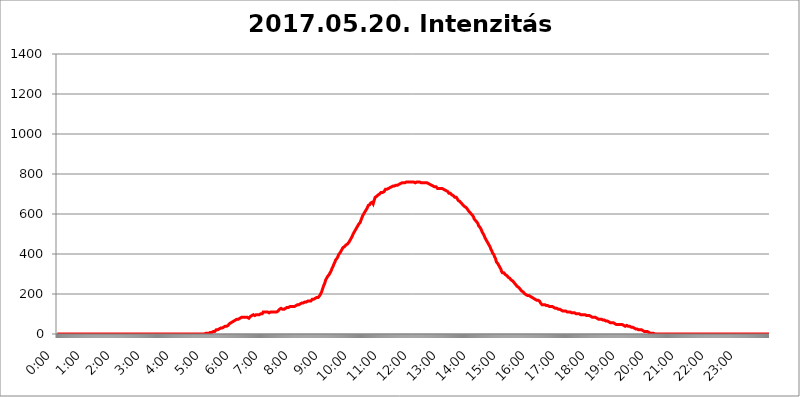
| Category | 2017.05.20. Intenzitás [W/m^2] |
|---|---|
| 0.0 | 0 |
| 0.0006944444444444445 | 0 |
| 0.001388888888888889 | 0 |
| 0.0020833333333333333 | 0 |
| 0.002777777777777778 | 0 |
| 0.003472222222222222 | 0 |
| 0.004166666666666667 | 0 |
| 0.004861111111111111 | 0 |
| 0.005555555555555556 | 0 |
| 0.0062499999999999995 | 0 |
| 0.006944444444444444 | 0 |
| 0.007638888888888889 | 0 |
| 0.008333333333333333 | 0 |
| 0.009027777777777779 | 0 |
| 0.009722222222222222 | 0 |
| 0.010416666666666666 | 0 |
| 0.011111111111111112 | 0 |
| 0.011805555555555555 | 0 |
| 0.012499999999999999 | 0 |
| 0.013194444444444444 | 0 |
| 0.013888888888888888 | 0 |
| 0.014583333333333332 | 0 |
| 0.015277777777777777 | 0 |
| 0.015972222222222224 | 0 |
| 0.016666666666666666 | 0 |
| 0.017361111111111112 | 0 |
| 0.018055555555555557 | 0 |
| 0.01875 | 0 |
| 0.019444444444444445 | 0 |
| 0.02013888888888889 | 0 |
| 0.020833333333333332 | 0 |
| 0.02152777777777778 | 0 |
| 0.022222222222222223 | 0 |
| 0.02291666666666667 | 0 |
| 0.02361111111111111 | 0 |
| 0.024305555555555556 | 0 |
| 0.024999999999999998 | 0 |
| 0.025694444444444447 | 0 |
| 0.02638888888888889 | 0 |
| 0.027083333333333334 | 0 |
| 0.027777777777777776 | 0 |
| 0.02847222222222222 | 0 |
| 0.029166666666666664 | 0 |
| 0.029861111111111113 | 0 |
| 0.030555555555555555 | 0 |
| 0.03125 | 0 |
| 0.03194444444444445 | 0 |
| 0.03263888888888889 | 0 |
| 0.03333333333333333 | 0 |
| 0.034027777777777775 | 0 |
| 0.034722222222222224 | 0 |
| 0.035416666666666666 | 0 |
| 0.036111111111111115 | 0 |
| 0.03680555555555556 | 0 |
| 0.0375 | 0 |
| 0.03819444444444444 | 0 |
| 0.03888888888888889 | 0 |
| 0.03958333333333333 | 0 |
| 0.04027777777777778 | 0 |
| 0.04097222222222222 | 0 |
| 0.041666666666666664 | 0 |
| 0.042361111111111106 | 0 |
| 0.04305555555555556 | 0 |
| 0.043750000000000004 | 0 |
| 0.044444444444444446 | 0 |
| 0.04513888888888889 | 0 |
| 0.04583333333333334 | 0 |
| 0.04652777777777778 | 0 |
| 0.04722222222222222 | 0 |
| 0.04791666666666666 | 0 |
| 0.04861111111111111 | 0 |
| 0.049305555555555554 | 0 |
| 0.049999999999999996 | 0 |
| 0.05069444444444445 | 0 |
| 0.051388888888888894 | 0 |
| 0.052083333333333336 | 0 |
| 0.05277777777777778 | 0 |
| 0.05347222222222222 | 0 |
| 0.05416666666666667 | 0 |
| 0.05486111111111111 | 0 |
| 0.05555555555555555 | 0 |
| 0.05625 | 0 |
| 0.05694444444444444 | 0 |
| 0.057638888888888885 | 0 |
| 0.05833333333333333 | 0 |
| 0.05902777777777778 | 0 |
| 0.059722222222222225 | 0 |
| 0.06041666666666667 | 0 |
| 0.061111111111111116 | 0 |
| 0.06180555555555556 | 0 |
| 0.0625 | 0 |
| 0.06319444444444444 | 0 |
| 0.06388888888888888 | 0 |
| 0.06458333333333334 | 0 |
| 0.06527777777777778 | 0 |
| 0.06597222222222222 | 0 |
| 0.06666666666666667 | 0 |
| 0.06736111111111111 | 0 |
| 0.06805555555555555 | 0 |
| 0.06874999999999999 | 0 |
| 0.06944444444444443 | 0 |
| 0.07013888888888889 | 0 |
| 0.07083333333333333 | 0 |
| 0.07152777777777779 | 0 |
| 0.07222222222222223 | 0 |
| 0.07291666666666667 | 0 |
| 0.07361111111111111 | 0 |
| 0.07430555555555556 | 0 |
| 0.075 | 0 |
| 0.07569444444444444 | 0 |
| 0.0763888888888889 | 0 |
| 0.07708333333333334 | 0 |
| 0.07777777777777778 | 0 |
| 0.07847222222222222 | 0 |
| 0.07916666666666666 | 0 |
| 0.0798611111111111 | 0 |
| 0.08055555555555556 | 0 |
| 0.08125 | 0 |
| 0.08194444444444444 | 0 |
| 0.08263888888888889 | 0 |
| 0.08333333333333333 | 0 |
| 0.08402777777777777 | 0 |
| 0.08472222222222221 | 0 |
| 0.08541666666666665 | 0 |
| 0.08611111111111112 | 0 |
| 0.08680555555555557 | 0 |
| 0.08750000000000001 | 0 |
| 0.08819444444444445 | 0 |
| 0.08888888888888889 | 0 |
| 0.08958333333333333 | 0 |
| 0.09027777777777778 | 0 |
| 0.09097222222222222 | 0 |
| 0.09166666666666667 | 0 |
| 0.09236111111111112 | 0 |
| 0.09305555555555556 | 0 |
| 0.09375 | 0 |
| 0.09444444444444444 | 0 |
| 0.09513888888888888 | 0 |
| 0.09583333333333333 | 0 |
| 0.09652777777777777 | 0 |
| 0.09722222222222222 | 0 |
| 0.09791666666666667 | 0 |
| 0.09861111111111111 | 0 |
| 0.09930555555555555 | 0 |
| 0.09999999999999999 | 0 |
| 0.10069444444444443 | 0 |
| 0.1013888888888889 | 0 |
| 0.10208333333333335 | 0 |
| 0.10277777777777779 | 0 |
| 0.10347222222222223 | 0 |
| 0.10416666666666667 | 0 |
| 0.10486111111111111 | 0 |
| 0.10555555555555556 | 0 |
| 0.10625 | 0 |
| 0.10694444444444444 | 0 |
| 0.1076388888888889 | 0 |
| 0.10833333333333334 | 0 |
| 0.10902777777777778 | 0 |
| 0.10972222222222222 | 0 |
| 0.1111111111111111 | 0 |
| 0.11180555555555556 | 0 |
| 0.11180555555555556 | 0 |
| 0.1125 | 0 |
| 0.11319444444444444 | 0 |
| 0.11388888888888889 | 0 |
| 0.11458333333333333 | 0 |
| 0.11527777777777777 | 0 |
| 0.11597222222222221 | 0 |
| 0.11666666666666665 | 0 |
| 0.1173611111111111 | 0 |
| 0.11805555555555557 | 0 |
| 0.11944444444444445 | 0 |
| 0.12013888888888889 | 0 |
| 0.12083333333333333 | 0 |
| 0.12152777777777778 | 0 |
| 0.12222222222222223 | 0 |
| 0.12291666666666667 | 0 |
| 0.12291666666666667 | 0 |
| 0.12361111111111112 | 0 |
| 0.12430555555555556 | 0 |
| 0.125 | 0 |
| 0.12569444444444444 | 0 |
| 0.12638888888888888 | 0 |
| 0.12708333333333333 | 0 |
| 0.16875 | 0 |
| 0.12847222222222224 | 0 |
| 0.12916666666666668 | 0 |
| 0.12986111111111112 | 0 |
| 0.13055555555555556 | 0 |
| 0.13125 | 0 |
| 0.13194444444444445 | 0 |
| 0.1326388888888889 | 0 |
| 0.13333333333333333 | 0 |
| 0.13402777777777777 | 0 |
| 0.13402777777777777 | 0 |
| 0.13472222222222222 | 0 |
| 0.13541666666666666 | 0 |
| 0.1361111111111111 | 0 |
| 0.13749999999999998 | 0 |
| 0.13819444444444443 | 0 |
| 0.1388888888888889 | 0 |
| 0.13958333333333334 | 0 |
| 0.14027777777777778 | 0 |
| 0.14097222222222222 | 0 |
| 0.14166666666666666 | 0 |
| 0.1423611111111111 | 0 |
| 0.14305555555555557 | 0 |
| 0.14375000000000002 | 0 |
| 0.14444444444444446 | 0 |
| 0.1451388888888889 | 0 |
| 0.1451388888888889 | 0 |
| 0.14652777777777778 | 0 |
| 0.14722222222222223 | 0 |
| 0.14791666666666667 | 0 |
| 0.1486111111111111 | 0 |
| 0.14930555555555555 | 0 |
| 0.15 | 0 |
| 0.15069444444444444 | 0 |
| 0.15138888888888888 | 0 |
| 0.15208333333333332 | 0 |
| 0.15277777777777776 | 0 |
| 0.15347222222222223 | 0 |
| 0.15416666666666667 | 0 |
| 0.15486111111111112 | 0 |
| 0.15555555555555556 | 0 |
| 0.15625 | 0 |
| 0.15694444444444444 | 0 |
| 0.15763888888888888 | 0 |
| 0.15833333333333333 | 0 |
| 0.15902777777777777 | 0 |
| 0.15972222222222224 | 0 |
| 0.16041666666666668 | 0 |
| 0.16111111111111112 | 0 |
| 0.16180555555555556 | 0 |
| 0.1625 | 0 |
| 0.16319444444444445 | 0 |
| 0.1638888888888889 | 0 |
| 0.16458333333333333 | 0 |
| 0.16527777777777777 | 0 |
| 0.16597222222222222 | 0 |
| 0.16666666666666666 | 0 |
| 0.1673611111111111 | 0 |
| 0.16805555555555554 | 0 |
| 0.16874999999999998 | 0 |
| 0.16944444444444443 | 0 |
| 0.17013888888888887 | 0 |
| 0.1708333333333333 | 0 |
| 0.17152777777777775 | 0 |
| 0.17222222222222225 | 0 |
| 0.1729166666666667 | 0 |
| 0.17361111111111113 | 0 |
| 0.17430555555555557 | 0 |
| 0.17500000000000002 | 0 |
| 0.17569444444444446 | 0 |
| 0.1763888888888889 | 0 |
| 0.17708333333333334 | 0 |
| 0.17777777777777778 | 0 |
| 0.17847222222222223 | 0 |
| 0.17916666666666667 | 0 |
| 0.1798611111111111 | 0 |
| 0.18055555555555555 | 0 |
| 0.18125 | 0 |
| 0.18194444444444444 | 0 |
| 0.1826388888888889 | 0 |
| 0.18333333333333335 | 0 |
| 0.1840277777777778 | 0 |
| 0.18472222222222223 | 0 |
| 0.18541666666666667 | 0 |
| 0.18611111111111112 | 0 |
| 0.18680555555555556 | 0 |
| 0.1875 | 0 |
| 0.18819444444444444 | 0 |
| 0.18888888888888888 | 0 |
| 0.18958333333333333 | 0 |
| 0.19027777777777777 | 0 |
| 0.1909722222222222 | 0 |
| 0.19166666666666665 | 0 |
| 0.19236111111111112 | 0 |
| 0.19305555555555554 | 0 |
| 0.19375 | 0 |
| 0.19444444444444445 | 0 |
| 0.1951388888888889 | 0 |
| 0.19583333333333333 | 0 |
| 0.19652777777777777 | 0 |
| 0.19722222222222222 | 0 |
| 0.19791666666666666 | 0 |
| 0.1986111111111111 | 0 |
| 0.19930555555555554 | 0 |
| 0.19999999999999998 | 0 |
| 0.20069444444444443 | 0 |
| 0.20138888888888887 | 0 |
| 0.2020833333333333 | 0 |
| 0.2027777777777778 | 0 |
| 0.2034722222222222 | 0 |
| 0.2041666666666667 | 0 |
| 0.20486111111111113 | 0 |
| 0.20555555555555557 | 0 |
| 0.20625000000000002 | 0 |
| 0.20694444444444446 | 3.525 |
| 0.2076388888888889 | 0 |
| 0.20833333333333334 | 3.525 |
| 0.20902777777777778 | 3.525 |
| 0.20972222222222223 | 3.525 |
| 0.21041666666666667 | 3.525 |
| 0.2111111111111111 | 3.525 |
| 0.21180555555555555 | 3.525 |
| 0.2125 | 3.525 |
| 0.21319444444444444 | 3.525 |
| 0.2138888888888889 | 7.887 |
| 0.21458333333333335 | 7.887 |
| 0.2152777777777778 | 7.887 |
| 0.21597222222222223 | 7.887 |
| 0.21666666666666667 | 7.887 |
| 0.21736111111111112 | 12.257 |
| 0.21805555555555556 | 12.257 |
| 0.21875 | 12.257 |
| 0.21944444444444444 | 12.257 |
| 0.22013888888888888 | 12.257 |
| 0.22083333333333333 | 12.257 |
| 0.22152777777777777 | 16.636 |
| 0.2222222222222222 | 16.636 |
| 0.22291666666666665 | 21.024 |
| 0.2236111111111111 | 21.024 |
| 0.22430555555555556 | 21.024 |
| 0.225 | 21.024 |
| 0.22569444444444445 | 21.024 |
| 0.2263888888888889 | 21.024 |
| 0.22708333333333333 | 25.419 |
| 0.22777777777777777 | 25.419 |
| 0.22847222222222222 | 25.419 |
| 0.22916666666666666 | 29.823 |
| 0.2298611111111111 | 29.823 |
| 0.23055555555555554 | 29.823 |
| 0.23124999999999998 | 29.823 |
| 0.23194444444444443 | 34.234 |
| 0.23263888888888887 | 34.234 |
| 0.2333333333333333 | 34.234 |
| 0.2340277777777778 | 34.234 |
| 0.2347222222222222 | 38.653 |
| 0.2354166666666667 | 38.653 |
| 0.23611111111111113 | 38.653 |
| 0.23680555555555557 | 38.653 |
| 0.23750000000000002 | 38.653 |
| 0.23819444444444446 | 38.653 |
| 0.2388888888888889 | 43.079 |
| 0.23958333333333334 | 43.079 |
| 0.24027777777777778 | 47.511 |
| 0.24097222222222223 | 47.511 |
| 0.24166666666666667 | 51.951 |
| 0.2423611111111111 | 56.398 |
| 0.24305555555555555 | 56.398 |
| 0.24375 | 56.398 |
| 0.24444444444444446 | 60.85 |
| 0.24513888888888888 | 60.85 |
| 0.24583333333333335 | 60.85 |
| 0.2465277777777778 | 65.31 |
| 0.24722222222222223 | 65.31 |
| 0.24791666666666667 | 65.31 |
| 0.24861111111111112 | 65.31 |
| 0.24930555555555556 | 69.775 |
| 0.25 | 69.775 |
| 0.25069444444444444 | 69.775 |
| 0.2513888888888889 | 69.775 |
| 0.2520833333333333 | 74.246 |
| 0.25277777777777777 | 74.246 |
| 0.2534722222222222 | 74.246 |
| 0.25416666666666665 | 74.246 |
| 0.2548611111111111 | 74.246 |
| 0.2555555555555556 | 78.722 |
| 0.25625000000000003 | 78.722 |
| 0.2569444444444445 | 78.722 |
| 0.2576388888888889 | 78.722 |
| 0.25833333333333336 | 83.205 |
| 0.2590277777777778 | 83.205 |
| 0.25972222222222224 | 83.205 |
| 0.2604166666666667 | 83.205 |
| 0.2611111111111111 | 83.205 |
| 0.26180555555555557 | 83.205 |
| 0.2625 | 83.205 |
| 0.26319444444444445 | 83.205 |
| 0.2638888888888889 | 83.205 |
| 0.26458333333333334 | 83.205 |
| 0.2652777777777778 | 83.205 |
| 0.2659722222222222 | 83.205 |
| 0.26666666666666666 | 83.205 |
| 0.2673611111111111 | 83.205 |
| 0.26805555555555555 | 83.205 |
| 0.26875 | 78.722 |
| 0.26944444444444443 | 78.722 |
| 0.2701388888888889 | 83.205 |
| 0.2708333333333333 | 87.692 |
| 0.27152777777777776 | 92.184 |
| 0.2722222222222222 | 92.184 |
| 0.27291666666666664 | 92.184 |
| 0.2736111111111111 | 92.184 |
| 0.2743055555555555 | 92.184 |
| 0.27499999999999997 | 96.682 |
| 0.27569444444444446 | 92.184 |
| 0.27638888888888885 | 92.184 |
| 0.27708333333333335 | 92.184 |
| 0.2777777777777778 | 96.682 |
| 0.27847222222222223 | 96.682 |
| 0.2791666666666667 | 96.682 |
| 0.2798611111111111 | 96.682 |
| 0.28055555555555556 | 96.682 |
| 0.28125 | 96.682 |
| 0.28194444444444444 | 96.682 |
| 0.2826388888888889 | 96.682 |
| 0.2833333333333333 | 96.682 |
| 0.28402777777777777 | 96.682 |
| 0.2847222222222222 | 96.682 |
| 0.28541666666666665 | 101.184 |
| 0.28611111111111115 | 101.184 |
| 0.28680555555555554 | 101.184 |
| 0.28750000000000003 | 101.184 |
| 0.2881944444444445 | 105.69 |
| 0.2888888888888889 | 110.201 |
| 0.28958333333333336 | 110.201 |
| 0.2902777777777778 | 110.201 |
| 0.29097222222222224 | 110.201 |
| 0.2916666666666667 | 110.201 |
| 0.2923611111111111 | 110.201 |
| 0.29305555555555557 | 110.201 |
| 0.29375 | 110.201 |
| 0.29444444444444445 | 105.69 |
| 0.2951388888888889 | 110.201 |
| 0.29583333333333334 | 105.69 |
| 0.2965277777777778 | 105.69 |
| 0.2972222222222222 | 105.69 |
| 0.29791666666666666 | 105.69 |
| 0.2986111111111111 | 110.201 |
| 0.29930555555555555 | 110.201 |
| 0.3 | 110.201 |
| 0.30069444444444443 | 110.201 |
| 0.3013888888888889 | 110.201 |
| 0.3020833333333333 | 110.201 |
| 0.30277777777777776 | 110.201 |
| 0.3034722222222222 | 110.201 |
| 0.30416666666666664 | 114.716 |
| 0.3048611111111111 | 110.201 |
| 0.3055555555555555 | 110.201 |
| 0.30624999999999997 | 110.201 |
| 0.3069444444444444 | 110.201 |
| 0.3076388888888889 | 110.201 |
| 0.30833333333333335 | 110.201 |
| 0.3090277777777778 | 110.201 |
| 0.30972222222222223 | 114.716 |
| 0.3104166666666667 | 114.716 |
| 0.3111111111111111 | 119.235 |
| 0.31180555555555556 | 123.758 |
| 0.3125 | 123.758 |
| 0.31319444444444444 | 128.284 |
| 0.3138888888888889 | 128.284 |
| 0.3145833333333333 | 128.284 |
| 0.31527777777777777 | 128.284 |
| 0.3159722222222222 | 123.758 |
| 0.31666666666666665 | 119.235 |
| 0.31736111111111115 | 123.758 |
| 0.31805555555555554 | 123.758 |
| 0.31875000000000003 | 123.758 |
| 0.3194444444444445 | 123.758 |
| 0.3201388888888889 | 128.284 |
| 0.32083333333333336 | 128.284 |
| 0.3215277777777778 | 132.814 |
| 0.32222222222222224 | 132.814 |
| 0.3229166666666667 | 132.814 |
| 0.3236111111111111 | 132.814 |
| 0.32430555555555557 | 132.814 |
| 0.325 | 132.814 |
| 0.32569444444444445 | 137.347 |
| 0.3263888888888889 | 137.347 |
| 0.32708333333333334 | 137.347 |
| 0.3277777777777778 | 137.347 |
| 0.3284722222222222 | 137.347 |
| 0.32916666666666666 | 137.347 |
| 0.3298611111111111 | 137.347 |
| 0.33055555555555555 | 137.347 |
| 0.33125 | 137.347 |
| 0.33194444444444443 | 137.347 |
| 0.3326388888888889 | 137.347 |
| 0.3333333333333333 | 137.347 |
| 0.3340277777777778 | 141.884 |
| 0.3347222222222222 | 141.884 |
| 0.3354166666666667 | 141.884 |
| 0.3361111111111111 | 146.423 |
| 0.3368055555555556 | 146.423 |
| 0.33749999999999997 | 146.423 |
| 0.33819444444444446 | 146.423 |
| 0.33888888888888885 | 146.423 |
| 0.33958333333333335 | 150.964 |
| 0.34027777777777773 | 150.964 |
| 0.34097222222222223 | 150.964 |
| 0.3416666666666666 | 150.964 |
| 0.3423611111111111 | 150.964 |
| 0.3430555555555555 | 155.509 |
| 0.34375 | 155.509 |
| 0.3444444444444445 | 155.509 |
| 0.3451388888888889 | 155.509 |
| 0.3458333333333334 | 155.509 |
| 0.34652777777777777 | 160.056 |
| 0.34722222222222227 | 160.056 |
| 0.34791666666666665 | 160.056 |
| 0.34861111111111115 | 160.056 |
| 0.34930555555555554 | 160.056 |
| 0.35000000000000003 | 160.056 |
| 0.3506944444444444 | 164.605 |
| 0.3513888888888889 | 164.605 |
| 0.3520833333333333 | 164.605 |
| 0.3527777777777778 | 164.605 |
| 0.3534722222222222 | 164.605 |
| 0.3541666666666667 | 164.605 |
| 0.3548611111111111 | 169.156 |
| 0.35555555555555557 | 164.605 |
| 0.35625 | 169.156 |
| 0.35694444444444445 | 169.156 |
| 0.3576388888888889 | 173.709 |
| 0.35833333333333334 | 173.709 |
| 0.3590277777777778 | 173.709 |
| 0.3597222222222222 | 173.709 |
| 0.36041666666666666 | 178.264 |
| 0.3611111111111111 | 178.264 |
| 0.36180555555555555 | 178.264 |
| 0.3625 | 178.264 |
| 0.36319444444444443 | 182.82 |
| 0.3638888888888889 | 182.82 |
| 0.3645833333333333 | 182.82 |
| 0.3652777777777778 | 182.82 |
| 0.3659722222222222 | 182.82 |
| 0.3666666666666667 | 187.378 |
| 0.3673611111111111 | 187.378 |
| 0.3680555555555556 | 191.937 |
| 0.36874999999999997 | 196.497 |
| 0.36944444444444446 | 201.058 |
| 0.37013888888888885 | 205.62 |
| 0.37083333333333335 | 210.182 |
| 0.37152777777777773 | 219.309 |
| 0.37222222222222223 | 223.873 |
| 0.3729166666666666 | 233 |
| 0.3736111111111111 | 242.127 |
| 0.3743055555555555 | 246.689 |
| 0.375 | 251.251 |
| 0.3756944444444445 | 260.373 |
| 0.3763888888888889 | 269.49 |
| 0.3770833333333334 | 274.047 |
| 0.37777777777777777 | 278.603 |
| 0.37847222222222227 | 283.156 |
| 0.37916666666666665 | 287.709 |
| 0.37986111111111115 | 287.709 |
| 0.38055555555555554 | 292.259 |
| 0.38125000000000003 | 296.808 |
| 0.3819444444444444 | 301.354 |
| 0.3826388888888889 | 305.898 |
| 0.3833333333333333 | 310.44 |
| 0.3840277777777778 | 314.98 |
| 0.3847222222222222 | 314.98 |
| 0.3854166666666667 | 328.584 |
| 0.3861111111111111 | 333.113 |
| 0.38680555555555557 | 337.639 |
| 0.3875 | 342.162 |
| 0.38819444444444445 | 351.198 |
| 0.3888888888888889 | 355.712 |
| 0.38958333333333334 | 360.221 |
| 0.3902777777777778 | 369.23 |
| 0.3909722222222222 | 369.23 |
| 0.39166666666666666 | 373.729 |
| 0.3923611111111111 | 378.224 |
| 0.39305555555555555 | 382.715 |
| 0.39375 | 387.202 |
| 0.39444444444444443 | 396.164 |
| 0.3951388888888889 | 396.164 |
| 0.3958333333333333 | 400.638 |
| 0.3965277777777778 | 405.108 |
| 0.3972222222222222 | 409.574 |
| 0.3979166666666667 | 414.035 |
| 0.3986111111111111 | 418.492 |
| 0.3993055555555556 | 422.943 |
| 0.39999999999999997 | 427.39 |
| 0.40069444444444446 | 431.833 |
| 0.40138888888888885 | 431.833 |
| 0.40208333333333335 | 436.27 |
| 0.40277777777777773 | 436.27 |
| 0.40347222222222223 | 440.702 |
| 0.4041666666666666 | 440.702 |
| 0.4048611111111111 | 445.129 |
| 0.4055555555555555 | 445.129 |
| 0.40625 | 449.551 |
| 0.4069444444444445 | 449.551 |
| 0.4076388888888889 | 453.968 |
| 0.4083333333333334 | 453.968 |
| 0.40902777777777777 | 458.38 |
| 0.40972222222222227 | 458.38 |
| 0.41041666666666665 | 467.187 |
| 0.41111111111111115 | 471.582 |
| 0.41180555555555554 | 475.972 |
| 0.41250000000000003 | 480.356 |
| 0.4131944444444444 | 484.735 |
| 0.4138888888888889 | 489.108 |
| 0.4145833333333333 | 489.108 |
| 0.4152777777777778 | 502.192 |
| 0.4159722222222222 | 502.192 |
| 0.4166666666666667 | 506.542 |
| 0.4173611111111111 | 515.223 |
| 0.41805555555555557 | 515.223 |
| 0.41875 | 523.88 |
| 0.41944444444444445 | 528.2 |
| 0.4201388888888889 | 532.513 |
| 0.42083333333333334 | 536.82 |
| 0.4215277777777778 | 541.121 |
| 0.4222222222222222 | 541.121 |
| 0.42291666666666666 | 549.704 |
| 0.4236111111111111 | 549.704 |
| 0.42430555555555555 | 553.986 |
| 0.425 | 558.261 |
| 0.42569444444444443 | 566.793 |
| 0.4263888888888889 | 571.049 |
| 0.4270833333333333 | 579.542 |
| 0.4277777777777778 | 583.779 |
| 0.4284722222222222 | 592.233 |
| 0.4291666666666667 | 592.233 |
| 0.4298611111111111 | 600.661 |
| 0.4305555555555556 | 604.864 |
| 0.43124999999999997 | 604.864 |
| 0.43194444444444446 | 613.252 |
| 0.43263888888888885 | 617.436 |
| 0.43333333333333335 | 621.613 |
| 0.43402777777777773 | 621.613 |
| 0.43472222222222223 | 629.948 |
| 0.4354166666666666 | 634.105 |
| 0.4361111111111111 | 642.4 |
| 0.4368055555555555 | 642.4 |
| 0.4375 | 646.537 |
| 0.4381944444444445 | 646.537 |
| 0.4388888888888889 | 650.667 |
| 0.4395833333333334 | 654.791 |
| 0.44027777777777777 | 658.909 |
| 0.44097222222222227 | 658.909 |
| 0.44166666666666665 | 658.909 |
| 0.44236111111111115 | 658.909 |
| 0.44305555555555554 | 650.667 |
| 0.44375000000000003 | 654.791 |
| 0.4444444444444444 | 667.123 |
| 0.4451388888888889 | 667.123 |
| 0.4458333333333333 | 683.473 |
| 0.4465277777777778 | 687.544 |
| 0.4472222222222222 | 687.544 |
| 0.4479166666666667 | 687.544 |
| 0.4486111111111111 | 687.544 |
| 0.44930555555555557 | 691.608 |
| 0.45 | 695.666 |
| 0.45069444444444445 | 695.666 |
| 0.4513888888888889 | 699.717 |
| 0.45208333333333334 | 699.717 |
| 0.4527777777777778 | 703.762 |
| 0.4534722222222222 | 703.762 |
| 0.45416666666666666 | 707.8 |
| 0.4548611111111111 | 707.8 |
| 0.45555555555555555 | 707.8 |
| 0.45625 | 707.8 |
| 0.45694444444444443 | 707.8 |
| 0.4576388888888889 | 703.762 |
| 0.4583333333333333 | 711.832 |
| 0.4590277777777778 | 715.858 |
| 0.4597222222222222 | 715.858 |
| 0.4604166666666667 | 723.889 |
| 0.4611111111111111 | 723.889 |
| 0.4618055555555556 | 723.889 |
| 0.46249999999999997 | 723.889 |
| 0.46319444444444446 | 727.896 |
| 0.46388888888888885 | 719.877 |
| 0.46458333333333335 | 727.896 |
| 0.46527777777777773 | 731.896 |
| 0.46597222222222223 | 731.896 |
| 0.4666666666666666 | 731.896 |
| 0.4673611111111111 | 731.896 |
| 0.4680555555555555 | 735.89 |
| 0.46875 | 735.89 |
| 0.4694444444444445 | 735.89 |
| 0.4701388888888889 | 735.89 |
| 0.4708333333333334 | 739.877 |
| 0.47152777777777777 | 739.877 |
| 0.47222222222222227 | 739.877 |
| 0.47291666666666665 | 739.877 |
| 0.47361111111111115 | 743.859 |
| 0.47430555555555554 | 743.859 |
| 0.47500000000000003 | 743.859 |
| 0.4756944444444444 | 743.859 |
| 0.4763888888888889 | 743.859 |
| 0.4770833333333333 | 743.859 |
| 0.4777777777777778 | 743.859 |
| 0.4784722222222222 | 747.834 |
| 0.4791666666666667 | 747.834 |
| 0.4798611111111111 | 747.834 |
| 0.48055555555555557 | 751.803 |
| 0.48125 | 751.803 |
| 0.48194444444444445 | 751.803 |
| 0.4826388888888889 | 751.803 |
| 0.48333333333333334 | 755.766 |
| 0.4840277777777778 | 755.766 |
| 0.4847222222222222 | 755.766 |
| 0.48541666666666666 | 755.766 |
| 0.4861111111111111 | 755.766 |
| 0.48680555555555555 | 759.723 |
| 0.4875 | 755.766 |
| 0.48819444444444443 | 759.723 |
| 0.4888888888888889 | 759.723 |
| 0.4895833333333333 | 759.723 |
| 0.4902777777777778 | 759.723 |
| 0.4909722222222222 | 759.723 |
| 0.4916666666666667 | 759.723 |
| 0.4923611111111111 | 763.674 |
| 0.4930555555555556 | 763.674 |
| 0.49374999999999997 | 759.723 |
| 0.49444444444444446 | 759.723 |
| 0.49513888888888885 | 759.723 |
| 0.49583333333333335 | 759.723 |
| 0.49652777777777773 | 759.723 |
| 0.49722222222222223 | 759.723 |
| 0.4979166666666666 | 759.723 |
| 0.4986111111111111 | 759.723 |
| 0.4993055555555555 | 759.723 |
| 0.5 | 759.723 |
| 0.5006944444444444 | 759.723 |
| 0.5013888888888889 | 759.723 |
| 0.5020833333333333 | 755.766 |
| 0.5027777777777778 | 759.723 |
| 0.5034722222222222 | 759.723 |
| 0.5041666666666667 | 759.723 |
| 0.5048611111111111 | 759.723 |
| 0.5055555555555555 | 759.723 |
| 0.50625 | 759.723 |
| 0.5069444444444444 | 755.766 |
| 0.5076388888888889 | 759.723 |
| 0.5083333333333333 | 759.723 |
| 0.5090277777777777 | 759.723 |
| 0.5097222222222222 | 755.766 |
| 0.5104166666666666 | 755.766 |
| 0.5111111111111112 | 755.766 |
| 0.5118055555555555 | 755.766 |
| 0.5125000000000001 | 755.766 |
| 0.5131944444444444 | 755.766 |
| 0.513888888888889 | 755.766 |
| 0.5145833333333333 | 755.766 |
| 0.5152777777777778 | 755.766 |
| 0.5159722222222222 | 755.766 |
| 0.5166666666666667 | 755.766 |
| 0.517361111111111 | 755.766 |
| 0.5180555555555556 | 755.766 |
| 0.5187499999999999 | 755.766 |
| 0.5194444444444445 | 751.803 |
| 0.5201388888888888 | 751.803 |
| 0.5208333333333334 | 751.803 |
| 0.5215277777777778 | 751.803 |
| 0.5222222222222223 | 751.803 |
| 0.5229166666666667 | 747.834 |
| 0.5236111111111111 | 747.834 |
| 0.5243055555555556 | 747.834 |
| 0.525 | 743.859 |
| 0.5256944444444445 | 743.859 |
| 0.5263888888888889 | 743.859 |
| 0.5270833333333333 | 739.877 |
| 0.5277777777777778 | 739.877 |
| 0.5284722222222222 | 735.89 |
| 0.5291666666666667 | 735.89 |
| 0.5298611111111111 | 735.89 |
| 0.5305555555555556 | 735.89 |
| 0.53125 | 735.89 |
| 0.5319444444444444 | 735.89 |
| 0.5326388888888889 | 731.896 |
| 0.5333333333333333 | 727.896 |
| 0.5340277777777778 | 727.896 |
| 0.5347222222222222 | 727.896 |
| 0.5354166666666667 | 727.896 |
| 0.5361111111111111 | 727.896 |
| 0.5368055555555555 | 727.896 |
| 0.5375 | 727.896 |
| 0.5381944444444444 | 727.896 |
| 0.5388888888888889 | 727.896 |
| 0.5395833333333333 | 727.896 |
| 0.5402777777777777 | 723.889 |
| 0.5409722222222222 | 723.889 |
| 0.5416666666666666 | 723.889 |
| 0.5423611111111112 | 719.877 |
| 0.5430555555555555 | 719.877 |
| 0.5437500000000001 | 719.877 |
| 0.5444444444444444 | 715.858 |
| 0.545138888888889 | 715.858 |
| 0.5458333333333333 | 715.858 |
| 0.5465277777777778 | 715.858 |
| 0.5472222222222222 | 711.832 |
| 0.5479166666666667 | 711.832 |
| 0.548611111111111 | 711.832 |
| 0.5493055555555556 | 703.762 |
| 0.5499999999999999 | 703.762 |
| 0.5506944444444445 | 703.762 |
| 0.5513888888888888 | 703.762 |
| 0.5520833333333334 | 703.762 |
| 0.5527777777777778 | 699.717 |
| 0.5534722222222223 | 695.666 |
| 0.5541666666666667 | 695.666 |
| 0.5548611111111111 | 691.608 |
| 0.5555555555555556 | 691.608 |
| 0.55625 | 687.544 |
| 0.5569444444444445 | 687.544 |
| 0.5576388888888889 | 683.473 |
| 0.5583333333333333 | 683.473 |
| 0.5590277777777778 | 683.473 |
| 0.5597222222222222 | 683.473 |
| 0.5604166666666667 | 683.473 |
| 0.5611111111111111 | 675.311 |
| 0.5618055555555556 | 671.22 |
| 0.5625 | 667.123 |
| 0.5631944444444444 | 667.123 |
| 0.5638888888888889 | 663.019 |
| 0.5645833333333333 | 663.019 |
| 0.5652777777777778 | 658.909 |
| 0.5659722222222222 | 658.909 |
| 0.5666666666666667 | 654.791 |
| 0.5673611111111111 | 650.667 |
| 0.5680555555555555 | 650.667 |
| 0.56875 | 646.537 |
| 0.5694444444444444 | 642.4 |
| 0.5701388888888889 | 642.4 |
| 0.5708333333333333 | 638.256 |
| 0.5715277777777777 | 638.256 |
| 0.5722222222222222 | 634.105 |
| 0.5729166666666666 | 634.105 |
| 0.5736111111111112 | 634.105 |
| 0.5743055555555555 | 629.948 |
| 0.5750000000000001 | 625.784 |
| 0.5756944444444444 | 621.613 |
| 0.576388888888889 | 617.436 |
| 0.5770833333333333 | 617.436 |
| 0.5777777777777778 | 613.252 |
| 0.5784722222222222 | 609.062 |
| 0.5791666666666667 | 609.062 |
| 0.579861111111111 | 604.864 |
| 0.5805555555555556 | 600.661 |
| 0.5812499999999999 | 600.661 |
| 0.5819444444444445 | 596.45 |
| 0.5826388888888888 | 592.233 |
| 0.5833333333333334 | 588.009 |
| 0.5840277777777778 | 583.779 |
| 0.5847222222222223 | 575.299 |
| 0.5854166666666667 | 575.299 |
| 0.5861111111111111 | 571.049 |
| 0.5868055555555556 | 566.793 |
| 0.5875 | 566.793 |
| 0.5881944444444445 | 562.53 |
| 0.5888888888888889 | 558.261 |
| 0.5895833333333333 | 553.986 |
| 0.5902777777777778 | 549.704 |
| 0.5909722222222222 | 541.121 |
| 0.5916666666666667 | 541.121 |
| 0.5923611111111111 | 536.82 |
| 0.5930555555555556 | 532.513 |
| 0.59375 | 528.2 |
| 0.5944444444444444 | 523.88 |
| 0.5951388888888889 | 519.555 |
| 0.5958333333333333 | 510.885 |
| 0.5965277777777778 | 506.542 |
| 0.5972222222222222 | 502.192 |
| 0.5979166666666667 | 497.836 |
| 0.5986111111111111 | 493.475 |
| 0.5993055555555555 | 489.108 |
| 0.6 | 480.356 |
| 0.6006944444444444 | 475.972 |
| 0.6013888888888889 | 471.582 |
| 0.6020833333333333 | 467.187 |
| 0.6027777777777777 | 462.786 |
| 0.6034722222222222 | 458.38 |
| 0.6041666666666666 | 453.968 |
| 0.6048611111111112 | 449.551 |
| 0.6055555555555555 | 445.129 |
| 0.6062500000000001 | 440.702 |
| 0.6069444444444444 | 436.27 |
| 0.607638888888889 | 431.833 |
| 0.6083333333333333 | 422.943 |
| 0.6090277777777778 | 418.492 |
| 0.6097222222222222 | 414.035 |
| 0.6104166666666667 | 405.108 |
| 0.611111111111111 | 405.108 |
| 0.6118055555555556 | 400.638 |
| 0.6124999999999999 | 396.164 |
| 0.6131944444444445 | 387.202 |
| 0.6138888888888888 | 382.715 |
| 0.6145833333333334 | 378.224 |
| 0.6152777777777778 | 369.23 |
| 0.6159722222222223 | 360.221 |
| 0.6166666666666667 | 360.221 |
| 0.6173611111111111 | 355.712 |
| 0.6180555555555556 | 351.198 |
| 0.61875 | 346.682 |
| 0.6194444444444445 | 342.162 |
| 0.6201388888888889 | 337.639 |
| 0.6208333333333333 | 333.113 |
| 0.6215277777777778 | 328.584 |
| 0.6222222222222222 | 324.052 |
| 0.6229166666666667 | 314.98 |
| 0.6236111111111111 | 310.44 |
| 0.6243055555555556 | 305.898 |
| 0.625 | 305.898 |
| 0.6256944444444444 | 305.898 |
| 0.6263888888888889 | 305.898 |
| 0.6270833333333333 | 301.354 |
| 0.6277777777777778 | 301.354 |
| 0.6284722222222222 | 296.808 |
| 0.6291666666666667 | 296.808 |
| 0.6298611111111111 | 296.808 |
| 0.6305555555555555 | 292.259 |
| 0.63125 | 287.709 |
| 0.6319444444444444 | 287.709 |
| 0.6326388888888889 | 283.156 |
| 0.6333333333333333 | 283.156 |
| 0.6340277777777777 | 278.603 |
| 0.6347222222222222 | 278.603 |
| 0.6354166666666666 | 274.047 |
| 0.6361111111111112 | 274.047 |
| 0.6368055555555555 | 269.49 |
| 0.6375000000000001 | 269.49 |
| 0.6381944444444444 | 264.932 |
| 0.638888888888889 | 264.932 |
| 0.6395833333333333 | 260.373 |
| 0.6402777777777778 | 260.373 |
| 0.6409722222222222 | 255.813 |
| 0.6416666666666667 | 251.251 |
| 0.642361111111111 | 251.251 |
| 0.6430555555555556 | 246.689 |
| 0.6437499999999999 | 246.689 |
| 0.6444444444444445 | 242.127 |
| 0.6451388888888888 | 237.564 |
| 0.6458333333333334 | 233 |
| 0.6465277777777778 | 233 |
| 0.6472222222222223 | 233 |
| 0.6479166666666667 | 228.436 |
| 0.6486111111111111 | 228.436 |
| 0.6493055555555556 | 223.873 |
| 0.65 | 219.309 |
| 0.6506944444444445 | 219.309 |
| 0.6513888888888889 | 214.746 |
| 0.6520833333333333 | 214.746 |
| 0.6527777777777778 | 210.182 |
| 0.6534722222222222 | 210.182 |
| 0.6541666666666667 | 205.62 |
| 0.6548611111111111 | 205.62 |
| 0.6555555555555556 | 201.058 |
| 0.65625 | 201.058 |
| 0.6569444444444444 | 196.497 |
| 0.6576388888888889 | 196.497 |
| 0.6583333333333333 | 196.497 |
| 0.6590277777777778 | 191.937 |
| 0.6597222222222222 | 191.937 |
| 0.6604166666666667 | 191.937 |
| 0.6611111111111111 | 191.937 |
| 0.6618055555555555 | 191.937 |
| 0.6625 | 187.378 |
| 0.6631944444444444 | 187.378 |
| 0.6638888888888889 | 187.378 |
| 0.6645833333333333 | 182.82 |
| 0.6652777777777777 | 182.82 |
| 0.6659722222222222 | 182.82 |
| 0.6666666666666666 | 182.82 |
| 0.6673611111111111 | 178.264 |
| 0.6680555555555556 | 178.264 |
| 0.6687500000000001 | 178.264 |
| 0.6694444444444444 | 178.264 |
| 0.6701388888888888 | 173.709 |
| 0.6708333333333334 | 173.709 |
| 0.6715277777777778 | 173.709 |
| 0.6722222222222222 | 169.156 |
| 0.6729166666666666 | 169.156 |
| 0.6736111111111112 | 169.156 |
| 0.6743055555555556 | 169.156 |
| 0.6749999999999999 | 169.156 |
| 0.6756944444444444 | 169.156 |
| 0.6763888888888889 | 164.605 |
| 0.6770833333333334 | 160.056 |
| 0.6777777777777777 | 155.509 |
| 0.6784722222222223 | 150.964 |
| 0.6791666666666667 | 150.964 |
| 0.6798611111111111 | 146.423 |
| 0.6805555555555555 | 146.423 |
| 0.68125 | 146.423 |
| 0.6819444444444445 | 146.423 |
| 0.6826388888888889 | 146.423 |
| 0.6833333333333332 | 146.423 |
| 0.6840277777777778 | 146.423 |
| 0.6847222222222222 | 141.884 |
| 0.6854166666666667 | 146.423 |
| 0.686111111111111 | 141.884 |
| 0.6868055555555556 | 141.884 |
| 0.6875 | 141.884 |
| 0.6881944444444444 | 141.884 |
| 0.688888888888889 | 141.884 |
| 0.6895833333333333 | 141.884 |
| 0.6902777777777778 | 137.347 |
| 0.6909722222222222 | 137.347 |
| 0.6916666666666668 | 137.347 |
| 0.6923611111111111 | 137.347 |
| 0.6930555555555555 | 137.347 |
| 0.69375 | 137.347 |
| 0.6944444444444445 | 137.347 |
| 0.6951388888888889 | 132.814 |
| 0.6958333333333333 | 132.814 |
| 0.6965277777777777 | 132.814 |
| 0.6972222222222223 | 132.814 |
| 0.6979166666666666 | 132.814 |
| 0.6986111111111111 | 128.284 |
| 0.6993055555555556 | 128.284 |
| 0.7000000000000001 | 128.284 |
| 0.7006944444444444 | 128.284 |
| 0.7013888888888888 | 128.284 |
| 0.7020833333333334 | 128.284 |
| 0.7027777777777778 | 123.758 |
| 0.7034722222222222 | 123.758 |
| 0.7041666666666666 | 123.758 |
| 0.7048611111111112 | 123.758 |
| 0.7055555555555556 | 119.235 |
| 0.7062499999999999 | 119.235 |
| 0.7069444444444444 | 119.235 |
| 0.7076388888888889 | 119.235 |
| 0.7083333333333334 | 114.716 |
| 0.7090277777777777 | 114.716 |
| 0.7097222222222223 | 114.716 |
| 0.7104166666666667 | 114.716 |
| 0.7111111111111111 | 114.716 |
| 0.7118055555555555 | 114.716 |
| 0.7125 | 114.716 |
| 0.7131944444444445 | 114.716 |
| 0.7138888888888889 | 110.201 |
| 0.7145833333333332 | 110.201 |
| 0.7152777777777778 | 110.201 |
| 0.7159722222222222 | 110.201 |
| 0.7166666666666667 | 110.201 |
| 0.717361111111111 | 110.201 |
| 0.7180555555555556 | 110.201 |
| 0.71875 | 110.201 |
| 0.7194444444444444 | 110.201 |
| 0.720138888888889 | 110.201 |
| 0.7208333333333333 | 105.69 |
| 0.7215277777777778 | 105.69 |
| 0.7222222222222222 | 105.69 |
| 0.7229166666666668 | 105.69 |
| 0.7236111111111111 | 105.69 |
| 0.7243055555555555 | 105.69 |
| 0.725 | 105.69 |
| 0.7256944444444445 | 105.69 |
| 0.7263888888888889 | 105.69 |
| 0.7270833333333333 | 105.69 |
| 0.7277777777777777 | 101.184 |
| 0.7284722222222223 | 101.184 |
| 0.7291666666666666 | 101.184 |
| 0.7298611111111111 | 101.184 |
| 0.7305555555555556 | 101.184 |
| 0.7312500000000001 | 101.184 |
| 0.7319444444444444 | 101.184 |
| 0.7326388888888888 | 101.184 |
| 0.7333333333333334 | 101.184 |
| 0.7340277777777778 | 96.682 |
| 0.7347222222222222 | 101.184 |
| 0.7354166666666666 | 96.682 |
| 0.7361111111111112 | 96.682 |
| 0.7368055555555556 | 96.682 |
| 0.7374999999999999 | 96.682 |
| 0.7381944444444444 | 96.682 |
| 0.7388888888888889 | 96.682 |
| 0.7395833333333334 | 96.682 |
| 0.7402777777777777 | 96.682 |
| 0.7409722222222223 | 96.682 |
| 0.7416666666666667 | 92.184 |
| 0.7423611111111111 | 92.184 |
| 0.7430555555555555 | 92.184 |
| 0.74375 | 92.184 |
| 0.7444444444444445 | 92.184 |
| 0.7451388888888889 | 92.184 |
| 0.7458333333333332 | 92.184 |
| 0.7465277777777778 | 92.184 |
| 0.7472222222222222 | 87.692 |
| 0.7479166666666667 | 87.692 |
| 0.748611111111111 | 87.692 |
| 0.7493055555555556 | 87.692 |
| 0.75 | 87.692 |
| 0.7506944444444444 | 83.205 |
| 0.751388888888889 | 83.205 |
| 0.7520833333333333 | 83.205 |
| 0.7527777777777778 | 83.205 |
| 0.7534722222222222 | 83.205 |
| 0.7541666666666668 | 83.205 |
| 0.7548611111111111 | 83.205 |
| 0.7555555555555555 | 78.722 |
| 0.75625 | 78.722 |
| 0.7569444444444445 | 78.722 |
| 0.7576388888888889 | 78.722 |
| 0.7583333333333333 | 78.722 |
| 0.7590277777777777 | 74.246 |
| 0.7597222222222223 | 74.246 |
| 0.7604166666666666 | 74.246 |
| 0.7611111111111111 | 74.246 |
| 0.7618055555555556 | 74.246 |
| 0.7625000000000001 | 74.246 |
| 0.7631944444444444 | 74.246 |
| 0.7638888888888888 | 74.246 |
| 0.7645833333333334 | 69.775 |
| 0.7652777777777778 | 69.775 |
| 0.7659722222222222 | 69.775 |
| 0.7666666666666666 | 69.775 |
| 0.7673611111111112 | 69.775 |
| 0.7680555555555556 | 65.31 |
| 0.7687499999999999 | 65.31 |
| 0.7694444444444444 | 65.31 |
| 0.7701388888888889 | 65.31 |
| 0.7708333333333334 | 65.31 |
| 0.7715277777777777 | 65.31 |
| 0.7722222222222223 | 60.85 |
| 0.7729166666666667 | 60.85 |
| 0.7736111111111111 | 60.85 |
| 0.7743055555555555 | 60.85 |
| 0.775 | 60.85 |
| 0.7756944444444445 | 56.398 |
| 0.7763888888888889 | 56.398 |
| 0.7770833333333332 | 56.398 |
| 0.7777777777777778 | 56.398 |
| 0.7784722222222222 | 56.398 |
| 0.7791666666666667 | 56.398 |
| 0.779861111111111 | 56.398 |
| 0.7805555555555556 | 51.951 |
| 0.78125 | 51.951 |
| 0.7819444444444444 | 51.951 |
| 0.782638888888889 | 51.951 |
| 0.7833333333333333 | 51.951 |
| 0.7840277777777778 | 47.511 |
| 0.7847222222222222 | 47.511 |
| 0.7854166666666668 | 47.511 |
| 0.7861111111111111 | 47.511 |
| 0.7868055555555555 | 47.511 |
| 0.7875 | 47.511 |
| 0.7881944444444445 | 47.511 |
| 0.7888888888888889 | 47.511 |
| 0.7895833333333333 | 47.511 |
| 0.7902777777777777 | 47.511 |
| 0.7909722222222223 | 47.511 |
| 0.7916666666666666 | 47.511 |
| 0.7923611111111111 | 47.511 |
| 0.7930555555555556 | 47.511 |
| 0.7937500000000001 | 47.511 |
| 0.7944444444444444 | 43.079 |
| 0.7951388888888888 | 43.079 |
| 0.7958333333333334 | 38.653 |
| 0.7965277777777778 | 38.653 |
| 0.7972222222222222 | 43.079 |
| 0.7979166666666666 | 43.079 |
| 0.7986111111111112 | 43.079 |
| 0.7993055555555556 | 43.079 |
| 0.7999999999999999 | 43.079 |
| 0.8006944444444444 | 38.653 |
| 0.8013888888888889 | 38.653 |
| 0.8020833333333334 | 38.653 |
| 0.8027777777777777 | 38.653 |
| 0.8034722222222223 | 38.653 |
| 0.8041666666666667 | 38.653 |
| 0.8048611111111111 | 34.234 |
| 0.8055555555555555 | 34.234 |
| 0.80625 | 34.234 |
| 0.8069444444444445 | 34.234 |
| 0.8076388888888889 | 34.234 |
| 0.8083333333333332 | 34.234 |
| 0.8090277777777778 | 29.823 |
| 0.8097222222222222 | 29.823 |
| 0.8104166666666667 | 29.823 |
| 0.811111111111111 | 25.419 |
| 0.8118055555555556 | 25.419 |
| 0.8125 | 25.419 |
| 0.8131944444444444 | 25.419 |
| 0.813888888888889 | 25.419 |
| 0.8145833333333333 | 25.419 |
| 0.8152777777777778 | 21.024 |
| 0.8159722222222222 | 21.024 |
| 0.8166666666666668 | 21.024 |
| 0.8173611111111111 | 21.024 |
| 0.8180555555555555 | 21.024 |
| 0.81875 | 21.024 |
| 0.8194444444444445 | 21.024 |
| 0.8201388888888889 | 16.636 |
| 0.8208333333333333 | 16.636 |
| 0.8215277777777777 | 16.636 |
| 0.8222222222222223 | 16.636 |
| 0.8229166666666666 | 12.257 |
| 0.8236111111111111 | 12.257 |
| 0.8243055555555556 | 12.257 |
| 0.8250000000000001 | 12.257 |
| 0.8256944444444444 | 12.257 |
| 0.8263888888888888 | 12.257 |
| 0.8270833333333334 | 12.257 |
| 0.8277777777777778 | 12.257 |
| 0.8284722222222222 | 7.887 |
| 0.8291666666666666 | 7.887 |
| 0.8298611111111112 | 7.887 |
| 0.8305555555555556 | 7.887 |
| 0.8312499999999999 | 7.887 |
| 0.8319444444444444 | 3.525 |
| 0.8326388888888889 | 3.525 |
| 0.8333333333333334 | 3.525 |
| 0.8340277777777777 | 3.525 |
| 0.8347222222222223 | 3.525 |
| 0.8354166666666667 | 3.525 |
| 0.8361111111111111 | 3.525 |
| 0.8368055555555555 | 3.525 |
| 0.8375 | 0 |
| 0.8381944444444445 | 0 |
| 0.8388888888888889 | 0 |
| 0.8395833333333332 | 0 |
| 0.8402777777777778 | 0 |
| 0.8409722222222222 | 0 |
| 0.8416666666666667 | 0 |
| 0.842361111111111 | 0 |
| 0.8430555555555556 | 0 |
| 0.84375 | 0 |
| 0.8444444444444444 | 0 |
| 0.845138888888889 | 0 |
| 0.8458333333333333 | 0 |
| 0.8465277777777778 | 0 |
| 0.8472222222222222 | 0 |
| 0.8479166666666668 | 0 |
| 0.8486111111111111 | 0 |
| 0.8493055555555555 | 0 |
| 0.85 | 0 |
| 0.8506944444444445 | 0 |
| 0.8513888888888889 | 0 |
| 0.8520833333333333 | 0 |
| 0.8527777777777777 | 0 |
| 0.8534722222222223 | 0 |
| 0.8541666666666666 | 0 |
| 0.8548611111111111 | 0 |
| 0.8555555555555556 | 0 |
| 0.8562500000000001 | 0 |
| 0.8569444444444444 | 0 |
| 0.8576388888888888 | 0 |
| 0.8583333333333334 | 0 |
| 0.8590277777777778 | 0 |
| 0.8597222222222222 | 0 |
| 0.8604166666666666 | 0 |
| 0.8611111111111112 | 0 |
| 0.8618055555555556 | 0 |
| 0.8624999999999999 | 0 |
| 0.8631944444444444 | 0 |
| 0.8638888888888889 | 0 |
| 0.8645833333333334 | 0 |
| 0.8652777777777777 | 0 |
| 0.8659722222222223 | 0 |
| 0.8666666666666667 | 0 |
| 0.8673611111111111 | 0 |
| 0.8680555555555555 | 0 |
| 0.86875 | 0 |
| 0.8694444444444445 | 0 |
| 0.8701388888888889 | 0 |
| 0.8708333333333332 | 0 |
| 0.8715277777777778 | 0 |
| 0.8722222222222222 | 0 |
| 0.8729166666666667 | 0 |
| 0.873611111111111 | 0 |
| 0.8743055555555556 | 0 |
| 0.875 | 0 |
| 0.8756944444444444 | 0 |
| 0.876388888888889 | 0 |
| 0.8770833333333333 | 0 |
| 0.8777777777777778 | 0 |
| 0.8784722222222222 | 0 |
| 0.8791666666666668 | 0 |
| 0.8798611111111111 | 0 |
| 0.8805555555555555 | 0 |
| 0.88125 | 0 |
| 0.8819444444444445 | 0 |
| 0.8826388888888889 | 0 |
| 0.8833333333333333 | 0 |
| 0.8840277777777777 | 0 |
| 0.8847222222222223 | 0 |
| 0.8854166666666666 | 0 |
| 0.8861111111111111 | 0 |
| 0.8868055555555556 | 0 |
| 0.8875000000000001 | 0 |
| 0.8881944444444444 | 0 |
| 0.8888888888888888 | 0 |
| 0.8895833333333334 | 0 |
| 0.8902777777777778 | 0 |
| 0.8909722222222222 | 0 |
| 0.8916666666666666 | 0 |
| 0.8923611111111112 | 0 |
| 0.8930555555555556 | 0 |
| 0.8937499999999999 | 0 |
| 0.8944444444444444 | 0 |
| 0.8951388888888889 | 0 |
| 0.8958333333333334 | 0 |
| 0.8965277777777777 | 0 |
| 0.8972222222222223 | 0 |
| 0.8979166666666667 | 0 |
| 0.8986111111111111 | 0 |
| 0.8993055555555555 | 0 |
| 0.9 | 0 |
| 0.9006944444444445 | 0 |
| 0.9013888888888889 | 0 |
| 0.9020833333333332 | 0 |
| 0.9027777777777778 | 0 |
| 0.9034722222222222 | 0 |
| 0.9041666666666667 | 0 |
| 0.904861111111111 | 0 |
| 0.9055555555555556 | 0 |
| 0.90625 | 0 |
| 0.9069444444444444 | 0 |
| 0.907638888888889 | 0 |
| 0.9083333333333333 | 0 |
| 0.9090277777777778 | 0 |
| 0.9097222222222222 | 0 |
| 0.9104166666666668 | 0 |
| 0.9111111111111111 | 0 |
| 0.9118055555555555 | 0 |
| 0.9125 | 0 |
| 0.9131944444444445 | 0 |
| 0.9138888888888889 | 0 |
| 0.9145833333333333 | 0 |
| 0.9152777777777777 | 0 |
| 0.9159722222222223 | 0 |
| 0.9166666666666666 | 0 |
| 0.9173611111111111 | 0 |
| 0.9180555555555556 | 0 |
| 0.9187500000000001 | 0 |
| 0.9194444444444444 | 0 |
| 0.9201388888888888 | 0 |
| 0.9208333333333334 | 0 |
| 0.9215277777777778 | 0 |
| 0.9222222222222222 | 0 |
| 0.9229166666666666 | 0 |
| 0.9236111111111112 | 0 |
| 0.9243055555555556 | 0 |
| 0.9249999999999999 | 0 |
| 0.9256944444444444 | 0 |
| 0.9263888888888889 | 0 |
| 0.9270833333333334 | 0 |
| 0.9277777777777777 | 0 |
| 0.9284722222222223 | 0 |
| 0.9291666666666667 | 0 |
| 0.9298611111111111 | 0 |
| 0.9305555555555555 | 0 |
| 0.93125 | 0 |
| 0.9319444444444445 | 0 |
| 0.9326388888888889 | 0 |
| 0.9333333333333332 | 0 |
| 0.9340277777777778 | 0 |
| 0.9347222222222222 | 0 |
| 0.9354166666666667 | 0 |
| 0.936111111111111 | 0 |
| 0.9368055555555556 | 0 |
| 0.9375 | 0 |
| 0.9381944444444444 | 0 |
| 0.938888888888889 | 0 |
| 0.9395833333333333 | 0 |
| 0.9402777777777778 | 0 |
| 0.9409722222222222 | 0 |
| 0.9416666666666668 | 0 |
| 0.9423611111111111 | 0 |
| 0.9430555555555555 | 0 |
| 0.94375 | 0 |
| 0.9444444444444445 | 0 |
| 0.9451388888888889 | 0 |
| 0.9458333333333333 | 0 |
| 0.9465277777777777 | 0 |
| 0.9472222222222223 | 0 |
| 0.9479166666666666 | 0 |
| 0.9486111111111111 | 0 |
| 0.9493055555555556 | 0 |
| 0.9500000000000001 | 0 |
| 0.9506944444444444 | 0 |
| 0.9513888888888888 | 0 |
| 0.9520833333333334 | 0 |
| 0.9527777777777778 | 0 |
| 0.9534722222222222 | 0 |
| 0.9541666666666666 | 0 |
| 0.9548611111111112 | 0 |
| 0.9555555555555556 | 0 |
| 0.9562499999999999 | 0 |
| 0.9569444444444444 | 0 |
| 0.9576388888888889 | 0 |
| 0.9583333333333334 | 0 |
| 0.9590277777777777 | 0 |
| 0.9597222222222223 | 0 |
| 0.9604166666666667 | 0 |
| 0.9611111111111111 | 0 |
| 0.9618055555555555 | 0 |
| 0.9625 | 0 |
| 0.9631944444444445 | 0 |
| 0.9638888888888889 | 0 |
| 0.9645833333333332 | 0 |
| 0.9652777777777778 | 0 |
| 0.9659722222222222 | 0 |
| 0.9666666666666667 | 0 |
| 0.967361111111111 | 0 |
| 0.9680555555555556 | 0 |
| 0.96875 | 0 |
| 0.9694444444444444 | 0 |
| 0.970138888888889 | 0 |
| 0.9708333333333333 | 0 |
| 0.9715277777777778 | 0 |
| 0.9722222222222222 | 0 |
| 0.9729166666666668 | 0 |
| 0.9736111111111111 | 0 |
| 0.9743055555555555 | 0 |
| 0.975 | 0 |
| 0.9756944444444445 | 0 |
| 0.9763888888888889 | 0 |
| 0.9770833333333333 | 0 |
| 0.9777777777777777 | 0 |
| 0.9784722222222223 | 0 |
| 0.9791666666666666 | 0 |
| 0.9798611111111111 | 0 |
| 0.9805555555555556 | 0 |
| 0.9812500000000001 | 0 |
| 0.9819444444444444 | 0 |
| 0.9826388888888888 | 0 |
| 0.9833333333333334 | 0 |
| 0.9840277777777778 | 0 |
| 0.9847222222222222 | 0 |
| 0.9854166666666666 | 0 |
| 0.9861111111111112 | 0 |
| 0.9868055555555556 | 0 |
| 0.9874999999999999 | 0 |
| 0.9881944444444444 | 0 |
| 0.9888888888888889 | 0 |
| 0.9895833333333334 | 0 |
| 0.9902777777777777 | 0 |
| 0.9909722222222223 | 0 |
| 0.9916666666666667 | 0 |
| 0.9923611111111111 | 0 |
| 0.9930555555555555 | 0 |
| 0.99375 | 0 |
| 0.9944444444444445 | 0 |
| 0.9951388888888889 | 0 |
| 0.9958333333333332 | 0 |
| 0.9965277777777778 | 0 |
| 0.9972222222222222 | 0 |
| 0.9979166666666667 | 0 |
| 0.998611111111111 | 0 |
| 0.9993055555555556 | 0 |